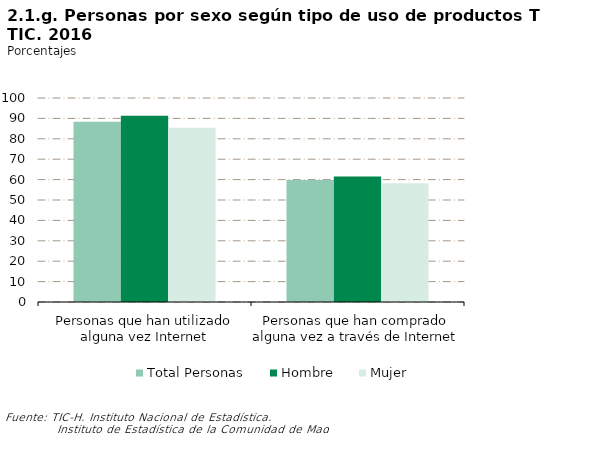
| Category | Total Personas | Hombre | Mujer |
|---|---|---|---|
| Personas que han utilizado alguna vez Internet | 88.312 | 91.354 | 85.468 |
| Personas que han comprado alguna vez a través de Internet | 59.794 | 61.459 | 58.238 |